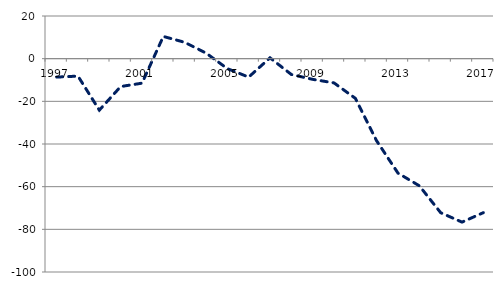
| Category | saldo |
|---|---|
| 1997.0 | -8632 |
| 1998.0 | -8181 |
| 1999.0 | -24131 |
| 2000.0 | -13069 |
| 2001.0 | -11485 |
| 2002.0 | 10420 |
| 2003.0 | 7664 |
| 2004.0 | 2639 |
| 2005.0 | -4665 |
| 2006.0 | -8642 |
| 2007.0 | 394 |
| 2008.0 | -7418 |
| 2009.0 | -9694 |
| 2010.0 | -11353 |
| 2011.0 | -18591 |
| 2012.0 | -38531 |
| 2013.0 | -53662 |
| 2014.0 | -59588 |
| 2015.0 | -72207 |
| 2016.0 | -76618 |
| 2017.0 | -72190 |